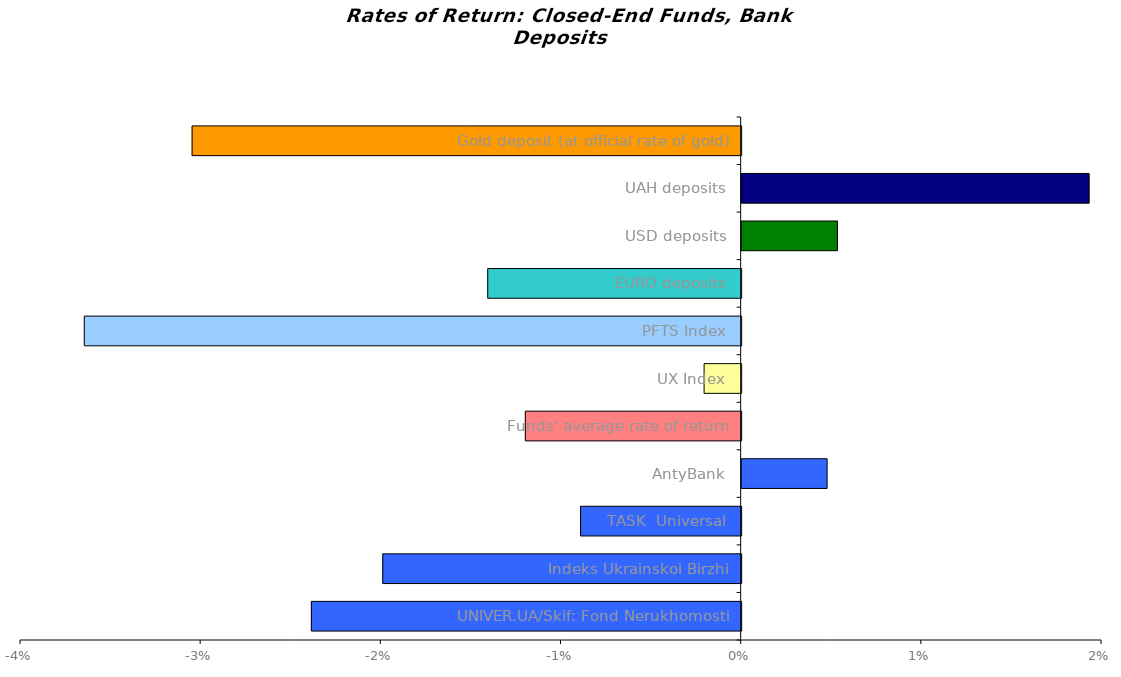
| Category | Series 0 |
|---|---|
| UNIVER.UA/Skif: Fond Nerukhomosti | -0.024 |
| Indeks Ukrainskoi Birzhi | -0.02 |
| TASK  Universal | -0.009 |
| AntyBank | 0.005 |
| Funds' average rate of return | -0.012 |
| UX Index | -0.002 |
| PFTS Index | -0.036 |
| EURO deposits | -0.014 |
| USD deposits | 0.005 |
| UAH deposits | 0.019 |
| Gold deposit (at official rate of gold) | -0.03 |